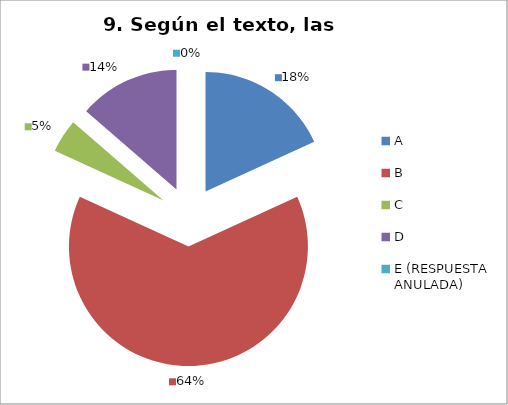
| Category | CANTIDAD DE RESPUESTAS PREGUNTA (9) | PORCENTAJE |
|---|---|---|
| A | 4 | 0.182 |
| B | 14 | 0.636 |
| C | 1 | 0.045 |
| D | 3 | 0.136 |
| E (RESPUESTA ANULADA) | 0 | 0 |